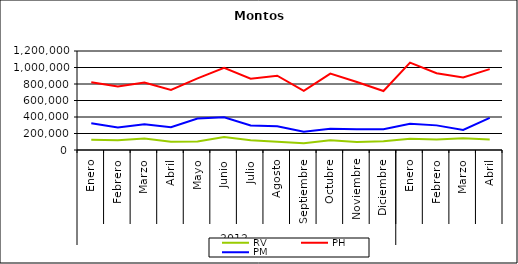
| Category | RV | PH | PM |
|---|---|---|---|
| 0 | 123119.659 | 819877.166 | 324690.254 |
| 1 | 119357.51 | 768583.334 | 272644.496 |
| 2 | 138093.991 | 817068.707 | 312641.558 |
| 3 | 100821.144 | 726813.436 | 276815.26 |
| 4 | 103097.59 | 868125.504 | 381195.355 |
| 5 | 158839.586 | 996800.775 | 396671.19 |
| 6 | 118513.148 | 865093.308 | 296421.982 |
| 7 | 99881.135 | 900298.029 | 288238.176 |
| 8 | 81045.519 | 716357.419 | 222239.842 |
| 9 | 117510.884 | 926749.531 | 256415.725 |
| 10 | 98379.537 | 824327.097 | 252401.818 |
| 11 | 105599.42 | 714733.451 | 252865.789 |
| 12 | 136808.804 | 1058774.967 | 316751.291 |
| 13 | 127193.421 | 930111.334 | 298480.292 |
| 14 | 142052.509 | 880100.908 | 242691.68 |
| 15 | 126637.277 | 980038.371 | 389833.89 |